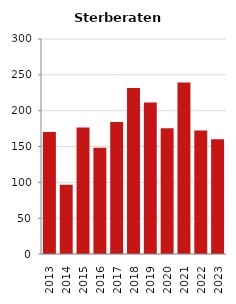
| Category | Sterberate der Bevölkerung ab 80 Jahre (auf Tsd.) |
|---|---|
| 2013.0 | 170.213 |
| 2014.0 | 96.774 |
| 2015.0 | 176.471 |
| 2016.0 | 148.148 |
| 2017.0 | 184.1 |
| 2018.0 | 231.76 |
| 2019.0 | 211.538 |
| 2020.0 | 175.355 |
| 2021.0 | 239.437 |
| 2022.0 | 172.414 |
| 2023.0 | 160 |